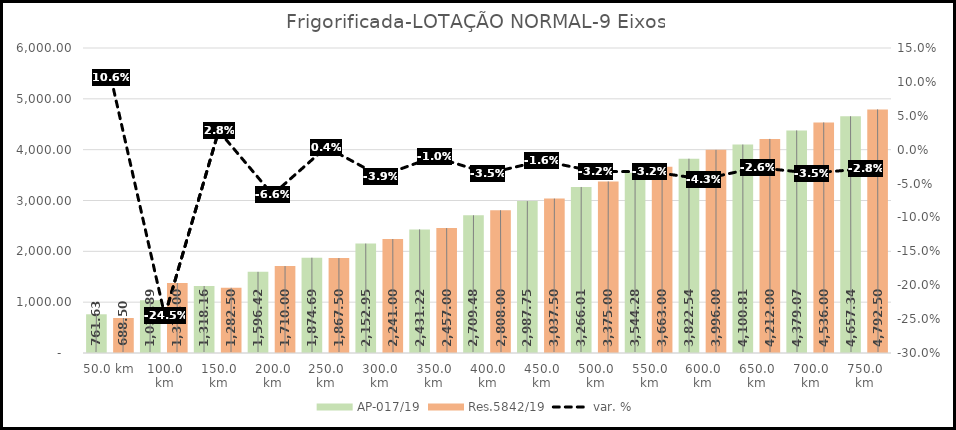
| Category | AP-017/19 | Res.5842/19 |
|---|---|---|
| 50.0 | 761.625 | 688.5 |
| 100.0 | 1039.89 | 1377 |
| 150.0 | 1318.155 | 1282.5 |
| 200.0 | 1596.42 | 1710 |
| 250.0 | 1874.685 | 1867.5 |
| 300.0 | 2152.95 | 2241 |
| 350.0 | 2431.215 | 2457 |
| 400.0 | 2709.48 | 2808 |
| 450.0 | 2987.745 | 3037.5 |
| 500.0 | 3266.01 | 3375 |
| 550.0 | 3544.275 | 3663 |
| 600.0 | 3822.54 | 3996 |
| 650.0 | 4100.805 | 4212 |
| 700.0 | 4379.07 | 4536 |
| 750.0 | 4657.335 | 4792.5 |